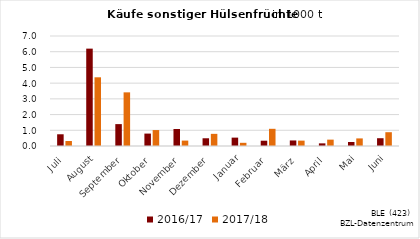
| Category | 2016/17 | 2017/18 |
|---|---|---|
| Juli | 0.746 | 0.317 |
| August | 6.196 | 4.372 |
| September | 1.393 | 3.414 |
| Oktober | 0.79 | 1.014 |
| November | 1.083 | 0.344 |
| Dezember | 0.492 | 0.773 |
| Januar | 0.533 | 0.203 |
| Februar | 0.337 | 1.094 |
| März | 0.353 | 0.342 |
| April | 0.168 | 0.405 |
| Mai | 0.253 | 0.483 |
| Juni | 0.495 | 0.878 |